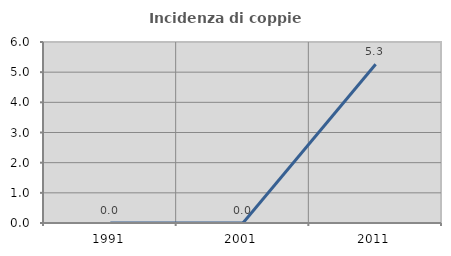
| Category | Incidenza di coppie miste |
|---|---|
| 1991.0 | 0 |
| 2001.0 | 0 |
| 2011.0 | 5.263 |